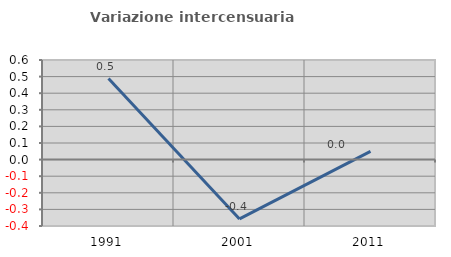
| Category | Variazione intercensuaria annua |
|---|---|
| 1991.0 | 0.488 |
| 2001.0 | -0.357 |
| 2011.0 | 0.049 |